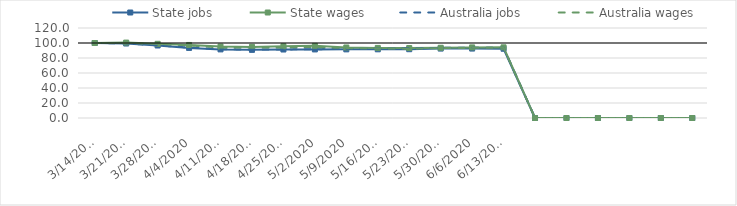
| Category | State jobs | State wages | Australia jobs | Australia wages |
|---|---|---|---|---|
| 14/03/2020 | 100 | 100 | 100 | 100 |
| 21/03/2020 | 99.292 | 100.549 | 99.495 | 100.113 |
| 28/03/2020 | 96.666 | 98.924 | 96.817 | 98.771 |
| 04/04/2020 | 93.426 | 97.379 | 93.908 | 96.774 |
| 11/04/2020 | 91.471 | 95.236 | 91.822 | 94.06 |
| 18/04/2020 | 90.841 | 94.814 | 91.153 | 93.831 |
| 25/04/2020 | 91.307 | 95.721 | 91.399 | 94.154 |
| 02/05/2020 | 91.419 | 96.245 | 91.732 | 94.697 |
| 09/05/2020 | 91.501 | 94.04 | 92.161 | 93.23 |
| 16/05/2020 | 91.567 | 93.45 | 92.673 | 92.722 |
| 23/05/2020 | 91.708 | 93.309 | 92.969 | 92.453 |
| 30/05/2020 | 92.557 | 93.627 | 93.509 | 93.187 |
| 06/06/2020 | 92.571 | 94.138 | 93.654 | 93.503 |
| 13/06/2020 | 92.351 | 94.229 | 93.635 | 93.681 |